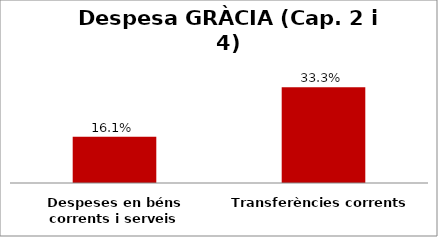
| Category | Series 0 |
|---|---|
| Despeses en béns corrents i serveis | 0.161 |
| Transferències corrents | 0.333 |